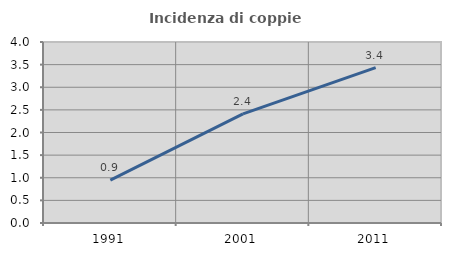
| Category | Incidenza di coppie miste |
|---|---|
| 1991.0 | 0.948 |
| 2001.0 | 2.412 |
| 2011.0 | 3.434 |